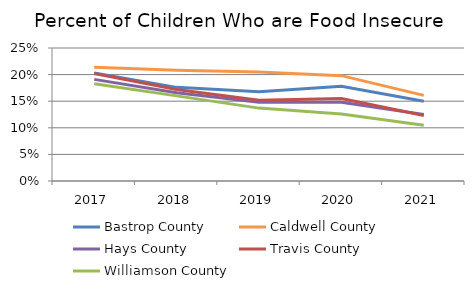
| Category | Bastrop County | Caldwell County | Hays County | Travis County | Williamson County |
|---|---|---|---|---|---|
| 2017.0 | 0.203 | 0.214 | 0.191 | 0.202 | 0.183 |
| 2018.0 | 0.176 | 0.208 | 0.166 | 0.172 | 0.16 |
| 2019.0 | 0.168 | 0.205 | 0.148 | 0.152 | 0.137 |
| 2020.0 | 0.178 | 0.198 | 0.148 | 0.155 | 0.126 |
| 2021.0 | 0.15 | 0.161 | 0.125 | 0.123 | 0.105 |